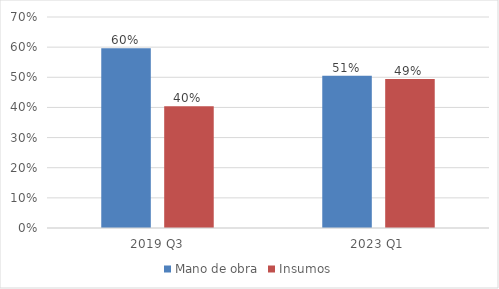
| Category | Mano de obra | Insumos |
|---|---|---|
| 2019 Q3 | 0.596 | 0.404 |
| 2023 Q1 | 0.505 | 0.495 |